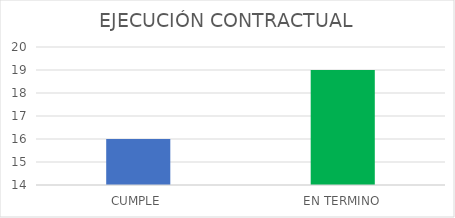
| Category | Series 0 |
|---|---|
| CUMPLE | 16 |
| EN TERMINO | 19 |